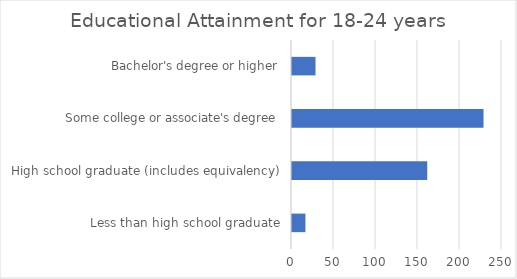
| Category | Series 0 |
|---|---|
| Less than high school graduate | 16 |
| High school graduate (includes equivalency) | 161 |
| Some college or associate's degree | 228 |
| Bachelor's degree or higher | 28 |